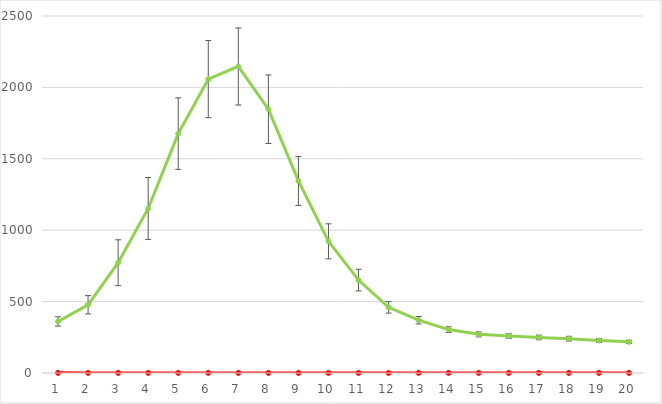
| Category | SMC3 | FISH |
|---|---|---|
| 0 | 1 | 360.961 |
| 1 | 0.856 | 477.666 |
| 2 | 0.751 | 772.182 |
| 3 | 0.76 | 1152.194 |
| 4 | 0.807 | 1676.204 |
| 5 | 0.816 | 2058.059 |
| 6 | 0.781 | 2146.561 |
| 7 | 0.739 | 1847.311 |
| 8 | 0.681 | 1344.962 |
| 9 | 0.648 | 922.114 |
| 10 | 0.659 | 650.776 |
| 11 | 0.699 | 459.919 |
| 12 | 0.732 | 369.718 |
| 13 | 0.71 | 303.941 |
| 14 | 0.66 | 270.653 |
| 15 | 0.648 | 258.746 |
| 16 | 0.613 | 248.915 |
| 17 | 0.601 | 240.417 |
| 18 | 0.607 | 227.742 |
| 19 | 0.615 | 218.006 |